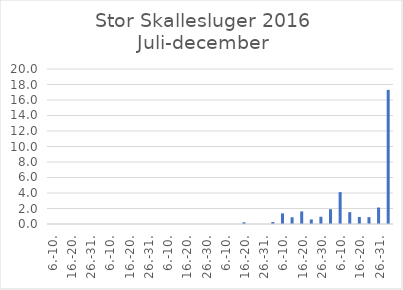
| Category | Series 0 |
|---|---|
| 6.-10. | 0 |
| 11.-15. | 0 |
| 16.-20. | 0 |
| 21.-25. | 0 |
| 26.-31. | 0 |
| 1.-5 | 0 |
| 6.-10. | 0 |
| 11.-15. | 0 |
| 16.-20. | 0 |
| 21.-25. | 0 |
| 26.-31. | 0 |
| 1.-5 | 0 |
| 6.-10. | 0 |
| 11.-15. | 0 |
| 16.-20. | 0 |
| 21.-25. | 0 |
| 26.-30. | 0 |
| 1.-5 | 0 |
| 6.-10. | 0 |
| 11.-15. | 0 |
| 16.-20. | 0.224 |
| 21.-25. | 0 |
| 26.-31. | 0 |
| 1.-5 | 0.251 |
| 6.-10. | 1.368 |
| 11.-15. | 0.866 |
| 16.-20. | 1.622 |
| 21.-25. | 0.585 |
| 26.-30. | 0.934 |
| 1.-5 | 1.91 |
| 6.-10. | 4.111 |
| 11.-15. | 1.53 |
| 16.-20. | 0.899 |
| 21.-25. | 0.881 |
| 26.-31. | 2.124 |
| I alt | 17.306 |